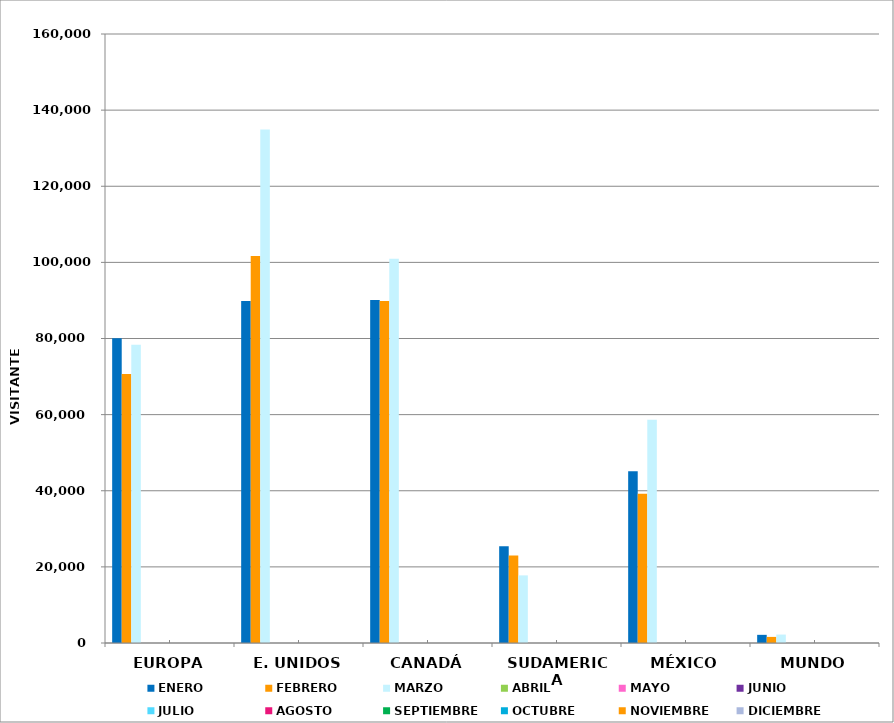
| Category | ENERO | FEBRERO | MARZO | ABRIL | MAYO | JUNIO | JULIO | AGOSTO | SEPTIEMBRE | OCTUBRE | NOVIEMBRE | DICIEMBRE |
|---|---|---|---|---|---|---|---|---|---|---|---|---|
| EUROPA | 80085 | 70666 | 78329 |  |  |  |  |  |  |  |  |  |
| E. UNIDOS | 89850 | 101692 | 134892 |  |  |  |  |  |  |  |  |  |
| CANADÁ | 90095 | 89828 | 100975 |  |  |  |  |  |  |  |  |  |
| SUDAMERICA | 25423 | 23012 | 17763 |  |  |  |  |  |  |  |  |  |
| MÉXICO | 45101 | 39217 | 58678 |  |  |  |  |  |  |  |  |  |
| MUNDO | 2144 | 1602 | 2215 |  |  |  |  |  |  |  |  |  |